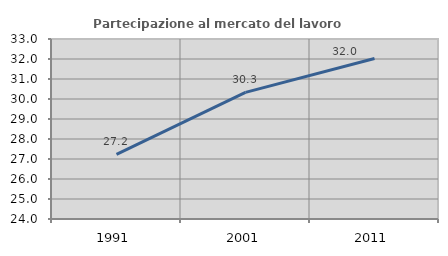
| Category | Partecipazione al mercato del lavoro  femminile |
|---|---|
| 1991.0 | 27.233 |
| 2001.0 | 30.333 |
| 2011.0 | 32.021 |